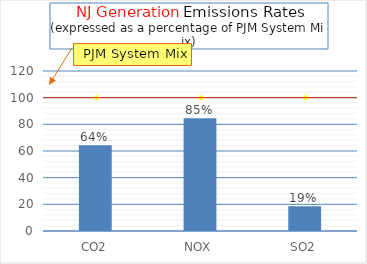
| Category | NJ Generation (%)  |
|---|---|
| CO2 | 64.325 |
| NOX | 84.561 |
| SO2 | 18.557 |